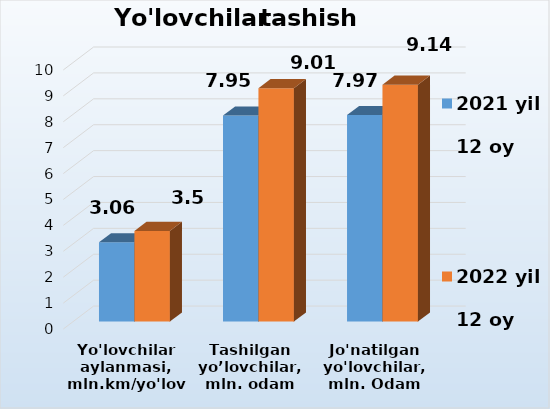
| Category | 2021 yil    
12 oy | 2022 yil    
12 oy |
|---|---|---|
| Yo'lovchilar aylanmasi, mln.km/yo'lovchi | 3.06 | 3.5 |
| Tashilgan yo’lovchilar, mln. odam | 7.95 | 9.01 |
| Jo'natilgan yo'lovchilar, mln. Odam | 7.97 | 9.14 |